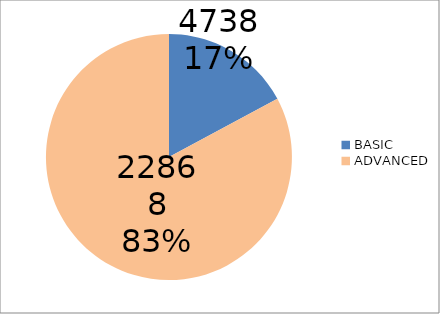
| Category | Series 0 |
|---|---|
| BASIC | 4738 |
| ADVANCED | 22868 |